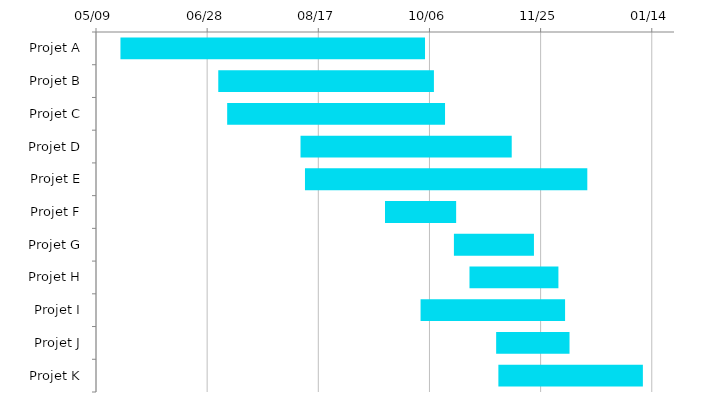
| Category | Début | Jours |
|---|---|---|
| Projet A | 2022-05-20 | 137 |
| Projet B | 2022-07-03 | 97 |
| Projet C | 2022-07-07 | 98 |
| Projet D | 2022-08-09 | 95 |
| Projet E | 2022-08-11 | 127 |
| Projet F | 2022-09-16 | 32 |
| Projet G | 2022-10-17 | 36 |
| Projet H | 2022-10-24 | 40 |
| Projet I | 2022-10-02 | 65 |
| Projet J | 2022-11-05 | 33 |
| Projet K | 2022-11-06 | 65 |